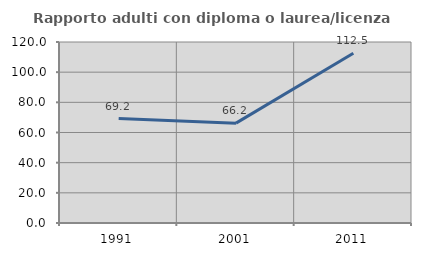
| Category | Rapporto adulti con diploma o laurea/licenza media  |
|---|---|
| 1991.0 | 69.231 |
| 2001.0 | 66.197 |
| 2011.0 | 112.5 |